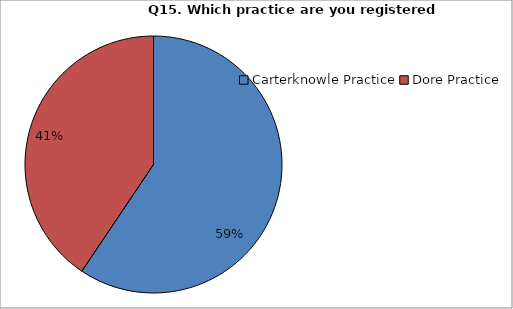
| Category | Series 0 |
|---|---|
| Carterknowle Practice | 262 |
| Dore Practice | 179 |